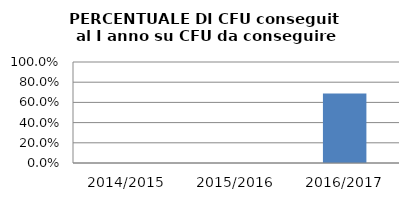
| Category | 2014/2015 2015/2016 2016/2017 |
|---|---|
| 2014/2015 | 0 |
| 2015/2016 | 0 |
| 2016/2017 | 0.689 |